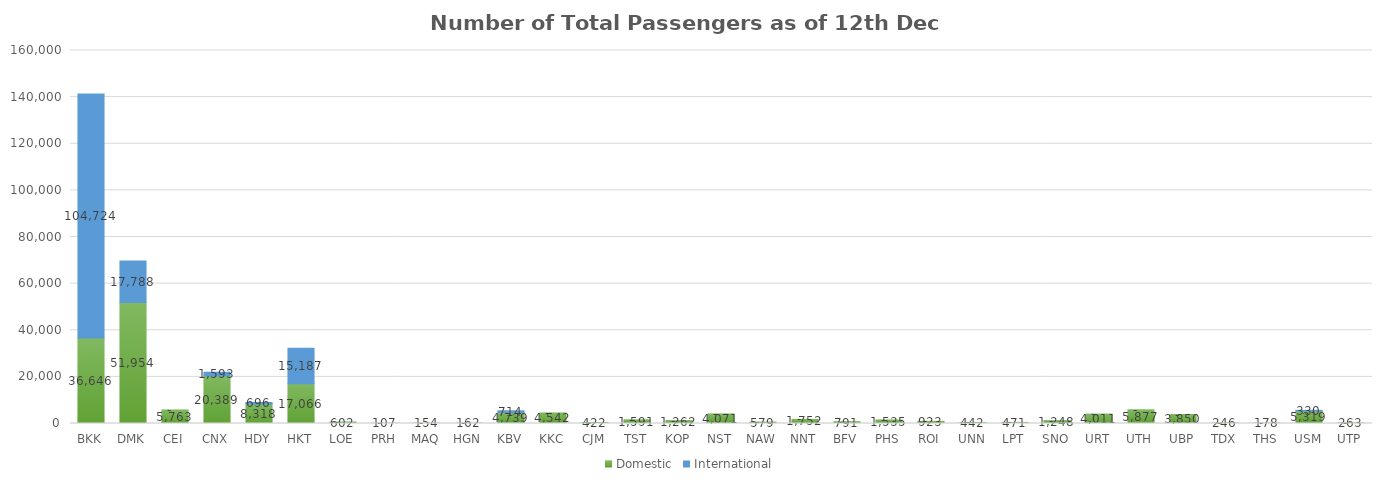
| Category | Domestic | International |
|---|---|---|
| BKK | 36646 | 104724 |
| DMK | 51954 | 17788 |
| CEI | 5763 | 0 |
| CNX | 20389 | 1593 |
| HDY | 8318 | 696 |
| HKT | 17066 | 15187 |
| LOE | 602 | 0 |
| PRH | 107 | 0 |
| MAQ | 154 | 0 |
| HGN | 162 | 0 |
| KBV | 4739 | 714 |
| KKC | 4542 | 0 |
| CJM | 422 | 0 |
| TST | 1591 | 0 |
| KOP | 1262 | 0 |
| NST | 4071 | 0 |
| NAW | 579 | 0 |
| NNT | 1752 | 0 |
| BFV | 791 | 0 |
| PHS | 1535 | 0 |
| ROI | 923 | 0 |
| UNN | 442 | 0 |
| LPT | 471 | 0 |
| SNO | 1248 | 0 |
| URT | 4011 | 0 |
| UTH | 5877 | 0 |
| UBP | 3850 | 0 |
| TDX | 246 | 0 |
| THS | 178 | 0 |
| USM | 5319 | 330 |
| UTP | 263 | 0 |